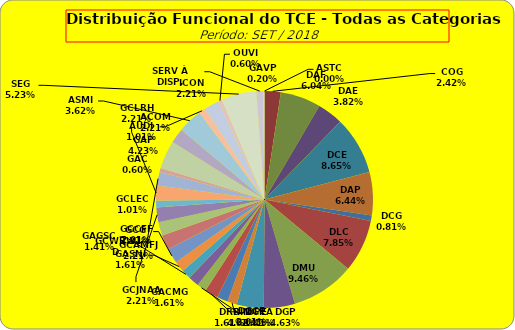
| Category | ASTC |
|---|---|
| ASTC | 0 |
| COG | 12 |
| DAF | 30 |
| DAE | 19 |
| DCE | 43 |
| DAP | 32 |
| DCG | 4 |
| DLC | 39 |
| DMU | 47 |
| DGP | 23 |
| DIN | 20 |
| DPE | 7 |
| DRR | 8 |
| DGCE | 10 |
| DGPA | 7 |
| GACMG | 8 |
| GAGSC | 7 |
| GASNI | 8 |
| GCG | 11 |
| GCAMFJ | 11 |
| GCCFF | 10 |
| GCJNAA | 11 |
| GCLEC | 5 |
| GCLRH | 11 |
| GCWRWD | 10 |
| GAC | 3 |
| GAP | 21 |
| ACOM | 11 |
| ASMI | 18 |
| AUDI | 5 |
| ICON | 11 |
| OUVI | 3 |
| SEG | 26 |
| SERV À DISP. | 5 |
| GAVP | 1 |